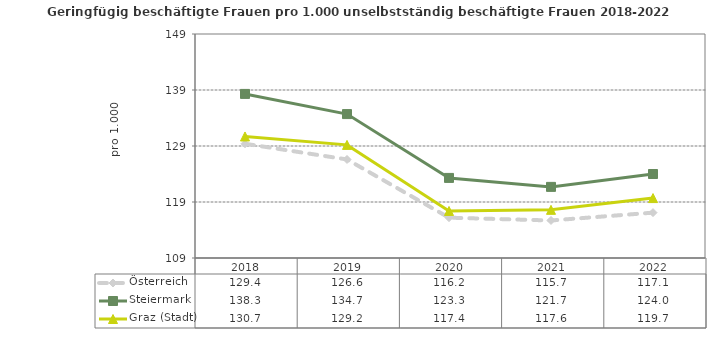
| Category | Österreich | Steiermark | Graz (Stadt) |
|---|---|---|---|
| 2022.0 | 117.1 | 124 | 119.7 |
| 2021.0 | 115.7 | 121.7 | 117.6 |
| 2020.0 | 116.2 | 123.3 | 117.4 |
| 2019.0 | 126.6 | 134.7 | 129.2 |
| 2018.0 | 129.4 | 138.3 | 130.7 |